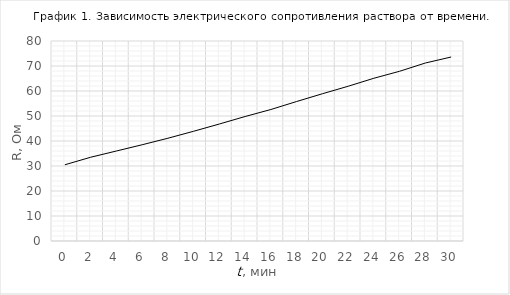
| Category | R, Ом |
|---|---|
| 0.0 | 30.5 |
| 2.0 | 33.5 |
| 4.0 | 36 |
| 6.0 | 38.5 |
| 8.0 | 41.1 |
| 10.0 | 43.9 |
| 12.0 | 46.8 |
| 14.0 | 49.8 |
| 16.0 | 52.6 |
| 18.0 | 55.8 |
| 20.0 | 58.9 |
| 22.0 | 61.9 |
| 24.0 | 65.1 |
| 26.0 | 67.9 |
| 28.0 | 71.2 |
| 30.0 | 73.6 |